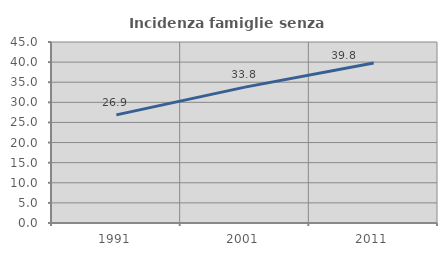
| Category | Incidenza famiglie senza nuclei |
|---|---|
| 1991.0 | 26.876 |
| 2001.0 | 33.786 |
| 2011.0 | 39.803 |